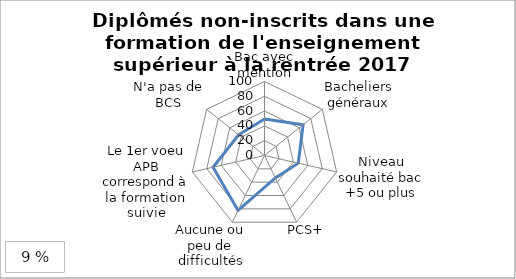
| Category | Diplômés non inscrits dans une formation de l'enseignement supérieur à la rentrée 2017 |
|---|---|
| Bac avec mention | 49.3 |
| Bacheliers généraux | 66.7 |
| Niveau souhaité bac +5 ou plus | 46.8 |
| PCS+ | 33.7 |
| Aucune ou peu de difficultés | 82.4 |
| Le 1er voeu APB correspond à la formation suivie | 71.3 |
| N'a pas de BCS | 44.8 |